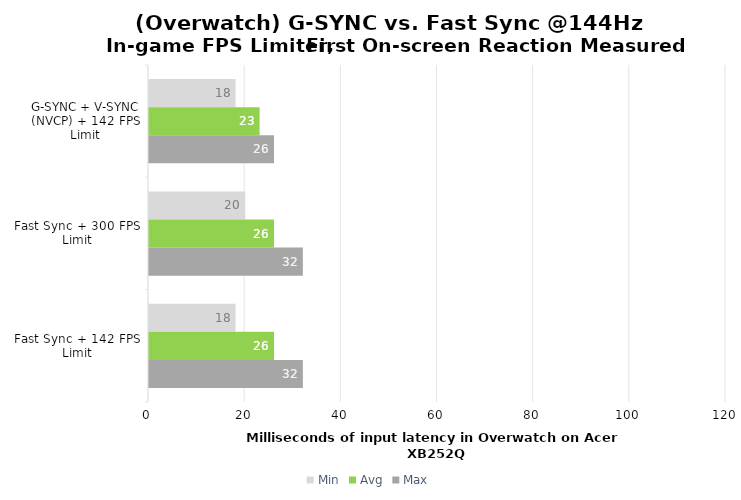
| Category | Min | Avg | Max |
|---|---|---|---|
| G-SYNC + V-SYNC (NVCP) + 142 FPS Limit | 18 | 23 | 26 |
| Fast Sync + 300 FPS Limit | 20 | 26 | 32 |
| Fast Sync + 142 FPS Limit | 18 | 26 | 32 |